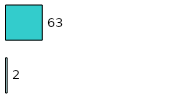
| Category | Series 0 | Series 1 |
|---|---|---|
| 0 | 2 | 63 |